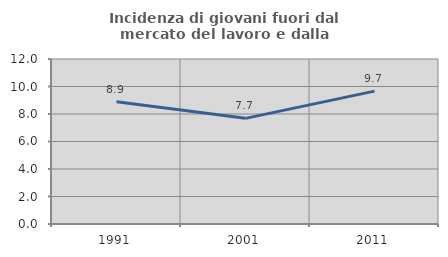
| Category | Incidenza di giovani fuori dal mercato del lavoro e dalla formazione  |
|---|---|
| 1991.0 | 8.884 |
| 2001.0 | 7.683 |
| 2011.0 | 9.663 |